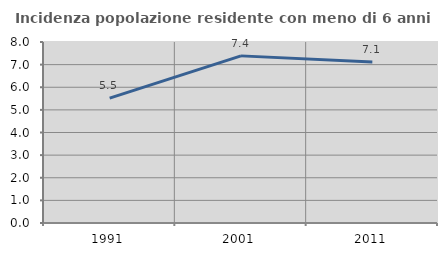
| Category | Incidenza popolazione residente con meno di 6 anni |
|---|---|
| 1991.0 | 5.517 |
| 2001.0 | 7.387 |
| 2011.0 | 7.117 |